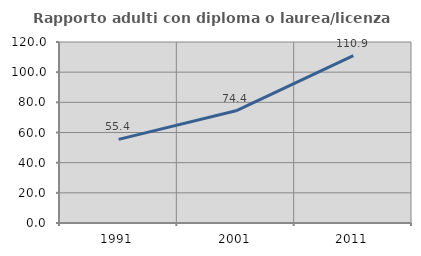
| Category | Rapporto adulti con diploma o laurea/licenza media  |
|---|---|
| 1991.0 | 55.426 |
| 2001.0 | 74.366 |
| 2011.0 | 110.933 |